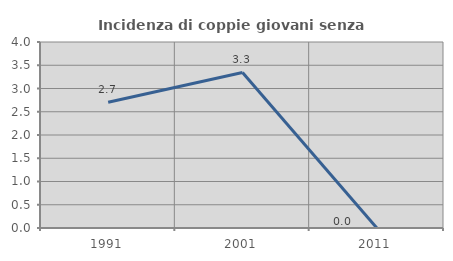
| Category | Incidenza di coppie giovani senza figli |
|---|---|
| 1991.0 | 2.703 |
| 2001.0 | 3.344 |
| 2011.0 | 0 |